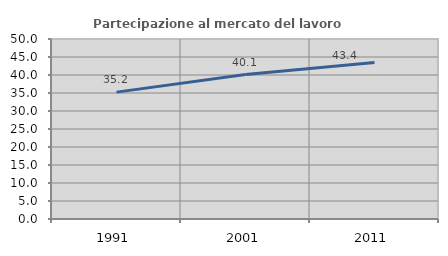
| Category | Partecipazione al mercato del lavoro  femminile |
|---|---|
| 1991.0 | 35.246 |
| 2001.0 | 40.139 |
| 2011.0 | 43.449 |